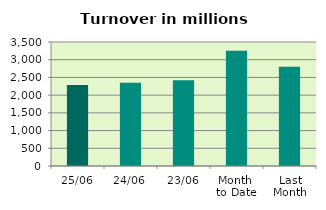
| Category | Series 0 |
|---|---|
| 25/06 | 2286.275 |
| 24/06 | 2348.964 |
| 23/06 | 2418.774 |
| Month 
to Date | 3253.698 |
| Last
Month | 2802.964 |